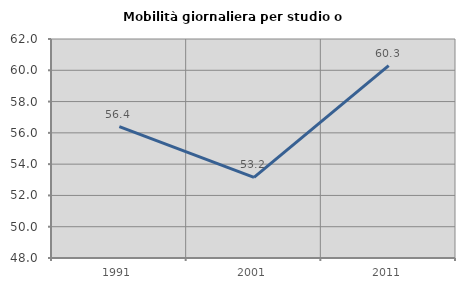
| Category | Mobilità giornaliera per studio o lavoro |
|---|---|
| 1991.0 | 56.399 |
| 2001.0 | 53.16 |
| 2011.0 | 60.302 |